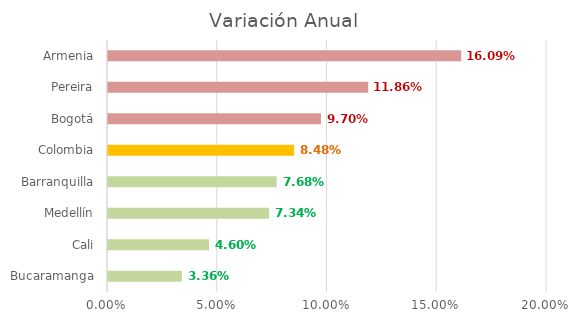
| Category | Variación Anual  |
|---|---|
| Bucaramanga | 0.034 |
| Cali | 0.046 |
| Medellín | 0.073 |
| Barranquilla | 0.077 |
| Colombia | 0.085 |
| Bogotá | 0.097 |
| Pereira | 0.119 |
| Armenia | 0.161 |